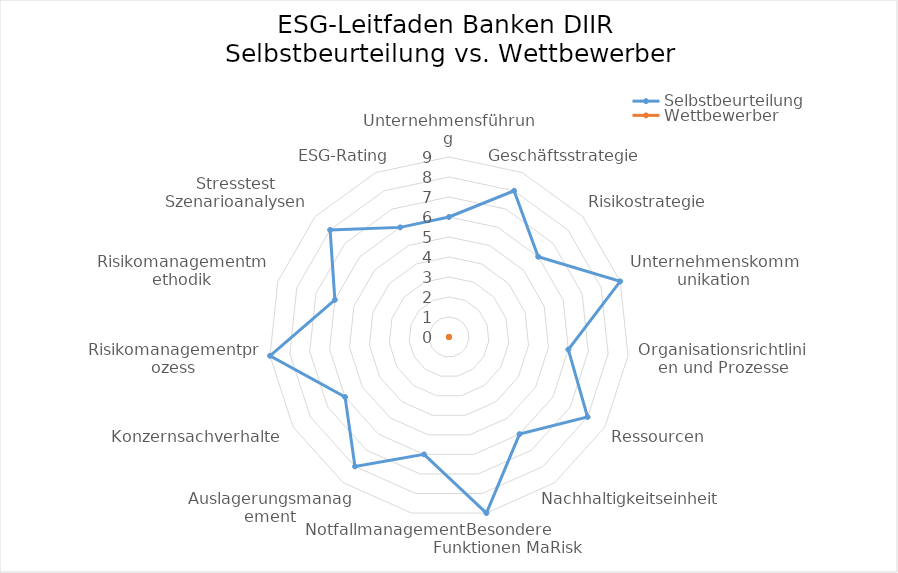
| Category | Selbstbeurteilung | Wettbewerber |
|---|---|---|
| Unternehmensführung | 6 |  |
| Geschäftsstrategie | 8 |  |
| Risikostrategie | 6 |  |
| Unternehmenskommunikation | 9 |  |
| Organisationsrichtlinien und Prozesse | 6 |  |
| Ressourcen | 8 |  |
| Nachhaltigkeitseinheit | 6 |  |
| Besondere Funktionen MaRisk | 9 |  |
| Notfallmanagement | 6 |  |
| Auslagerungsmanagement | 8 |  |
| Konzernsachverhalte | 6 |  |
| Risikomanagementprozess | 9 |  |
| Risikomanagementmethodik | 6 |  |
| Stresstest Szenarioanalysen | 8 |  |
| ESG-Rating | 6 |  |